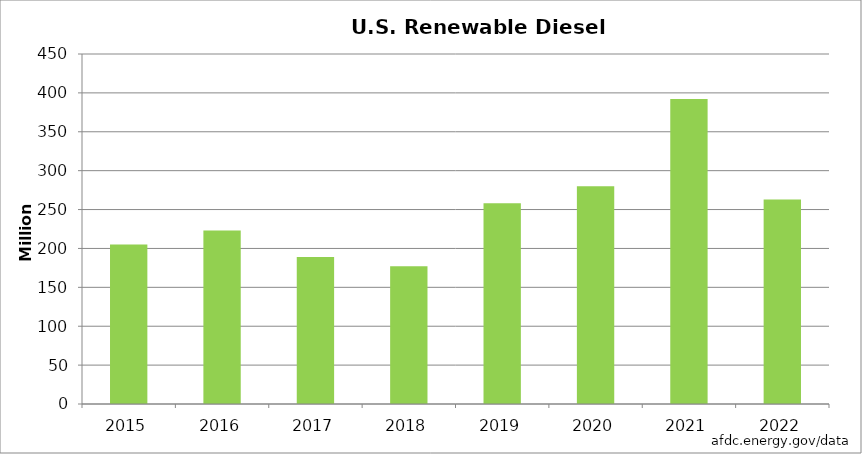
| Category | Series 1 |
|---|---|
| 2015.0 | 205 |
| 2016.0 | 223 |
| 2017.0 | 189 |
| 2018.0 | 177 |
| 2019.0 | 258 |
| 2020.0 | 280 |
| 2021.0 | 392 |
| 2022.0 | 263 |